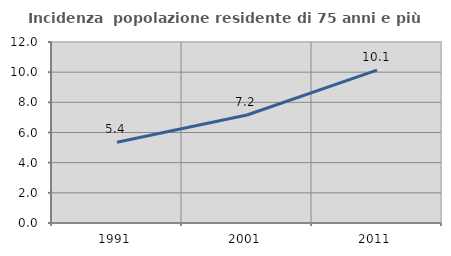
| Category | Incidenza  popolazione residente di 75 anni e più |
|---|---|
| 1991.0 | 5.355 |
| 2001.0 | 7.161 |
| 2011.0 | 10.138 |